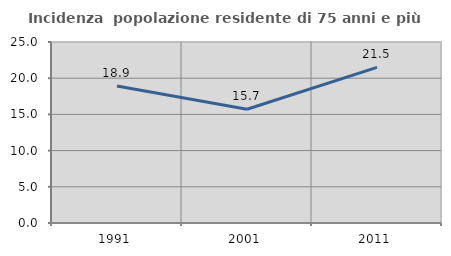
| Category | Incidenza  popolazione residente di 75 anni e più |
|---|---|
| 1991.0 | 18.919 |
| 2001.0 | 15.714 |
| 2011.0 | 21.488 |